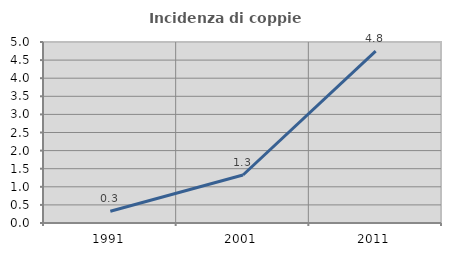
| Category | Incidenza di coppie miste |
|---|---|
| 1991.0 | 0.323 |
| 2001.0 | 1.326 |
| 2011.0 | 4.75 |